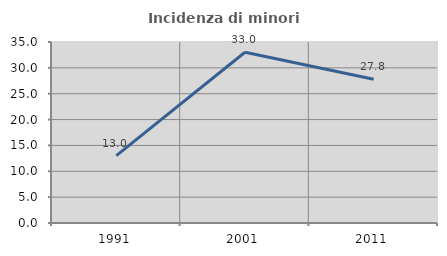
| Category | Incidenza di minori stranieri |
|---|---|
| 1991.0 | 13.043 |
| 2001.0 | 33.019 |
| 2011.0 | 27.801 |